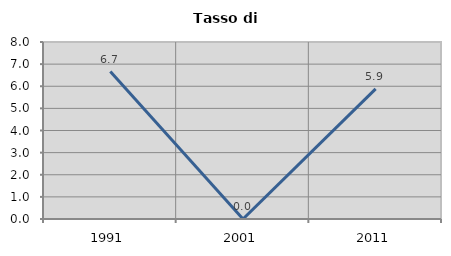
| Category | Tasso di disoccupazione   |
|---|---|
| 1991.0 | 6.667 |
| 2001.0 | 0 |
| 2011.0 | 5.882 |